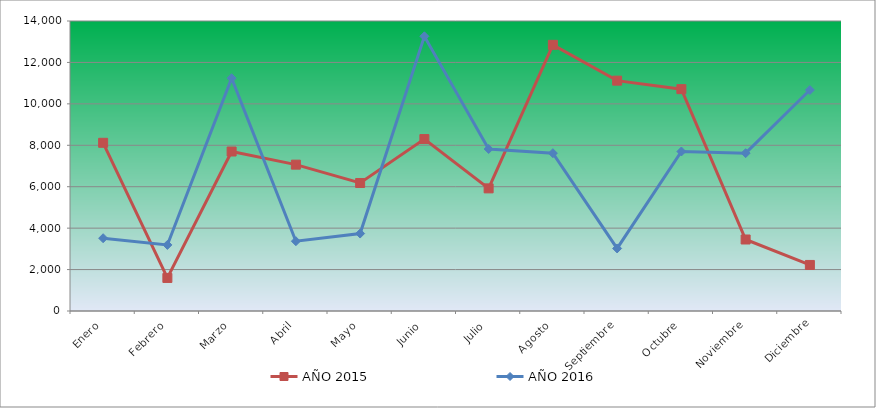
| Category | AÑO 2015 | AÑO 2016 |
|---|---|---|
| Enero | 8120 | 3513.815 |
| Febrero | 1595.887 | 3190.292 |
| Marzo | 7700 | 11237.868 |
| Abril | 7064.939 | 3370.027 |
| Mayo | 6180 | 3738.483 |
| Junio | 8300 | 13260.234 |
| Julio | 5920 | 7820 |
| Agosto | 12849.031 | 7620 |
| Septiembre | 11120.736 | 3020 |
| Octubre | 10709.706 | 7700 |
| Noviembre | 3451.779 | 7620 |
| Diciembre | 2223.483 | 10667.831 |